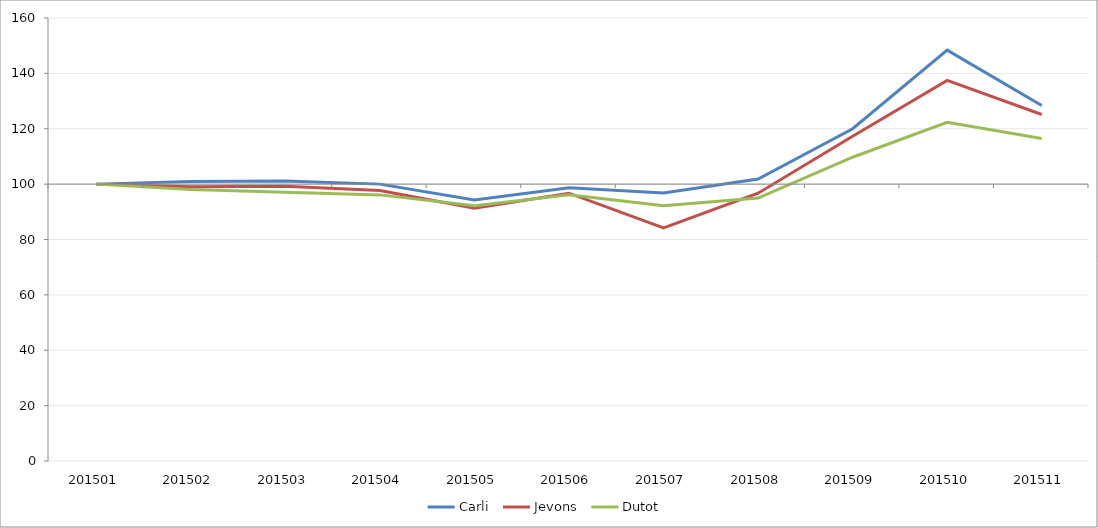
| Category | Carli | Jevons | Dutot |
|---|---|---|---|
| 201501.0 | 100 | 100 | 100 |
| 201502.0 | 100.952 | 99.029 | 98.058 |
| 201503.0 | 101.111 | 99.248 | 97.087 |
| 201504.0 | 100 | 97.672 | 96.116 |
| 201505.0 | 94.286 | 91.315 | 92.232 |
| 201506.0 | 98.73 | 96.723 | 96.116 |
| 201507.0 | 96.825 | 84.203 | 92.232 |
| 201508.0 | 101.841 | 96.723 | 94.951 |
| 201509.0 | 120 | 117.316 | 109.71 |
| 201510.0 | 148.413 | 137.473 | 122.332 |
| 201511.0 | 128.413 | 125.139 | 116.506 |